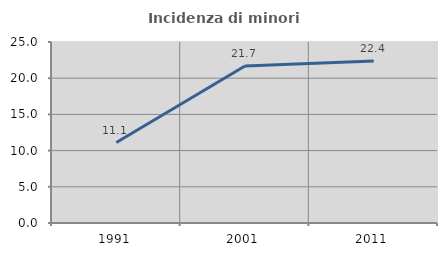
| Category | Incidenza di minori stranieri |
|---|---|
| 1991.0 | 11.111 |
| 2001.0 | 21.687 |
| 2011.0 | 22.378 |